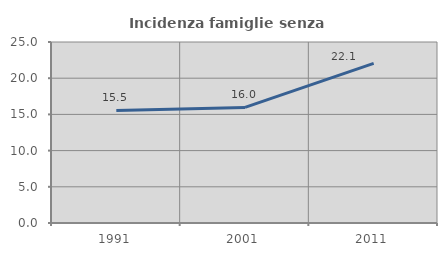
| Category | Incidenza famiglie senza nuclei |
|---|---|
| 1991.0 | 15.54 |
| 2001.0 | 15.969 |
| 2011.0 | 22.051 |